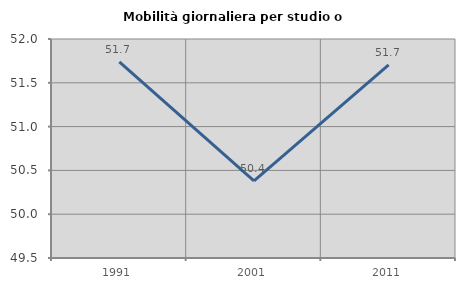
| Category | Mobilità giornaliera per studio o lavoro |
|---|---|
| 1991.0 | 51.739 |
| 2001.0 | 50.38 |
| 2011.0 | 51.704 |